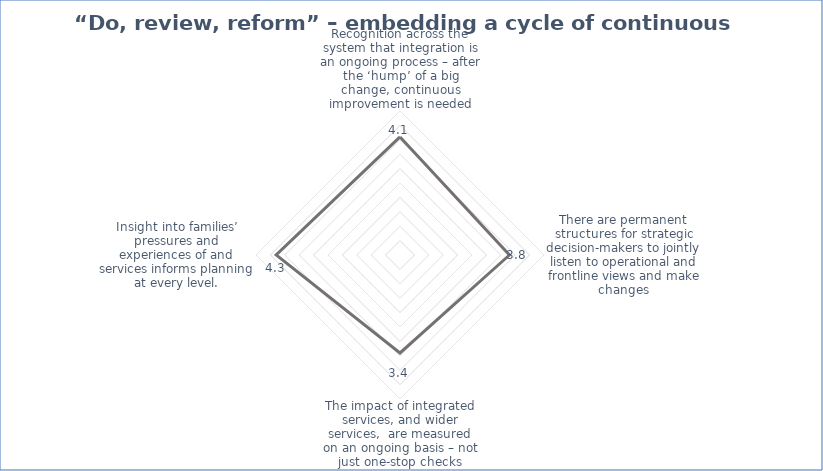
| Category | Series 0 |
|---|---|
| Recognition across the system that integration is an ongoing process – after the ‘hump’ of a big change, continuous improvement is needed | 4.1 |
| There are permanent structures for strategic decision-makers to jointly listen to operational and frontline views and make changes | 3.8 |
| The impact of integrated services, and wider services,  are measured on an ongoing basis – not just one-stop checks | 3.4 |
| Insight into families’ pressures and experiences of and services informs planning at every level. | 4.3 |